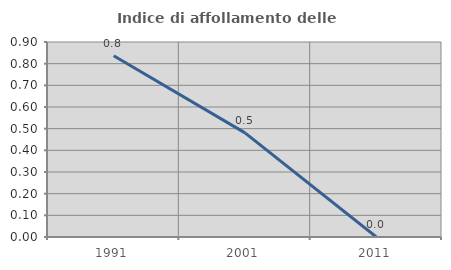
| Category | Indice di affollamento delle abitazioni  |
|---|---|
| 1991.0 | 0.837 |
| 2001.0 | 0.481 |
| 2011.0 | 0 |